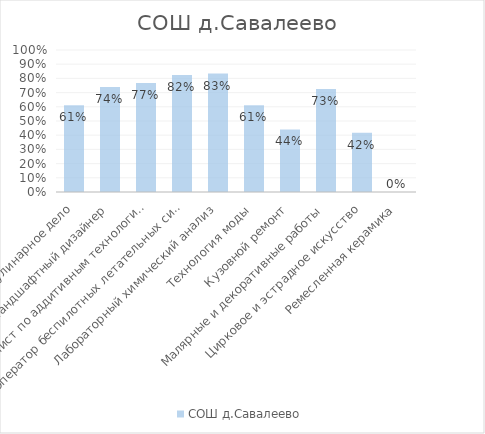
| Category | СОШ д.Савалеево |
|---|---|
| Кулинарное дело | 0.611 |
| Ландшафтный дизайнер | 0.739 |
| Специалист по аддитивным технологиям | 0.768 |
| Оператор беспилотных летательных систем | 0.825 |
| Лабораторный химический анализ | 0.834 |
| Технология моды | 0.611 |
| Кузовной ремонт | 0.441 |
| Малярные и декоративные работы | 0.725 |
| Цирковое и эстрадное искусство | 0.417 |
| Ремесленная керамика | 0 |